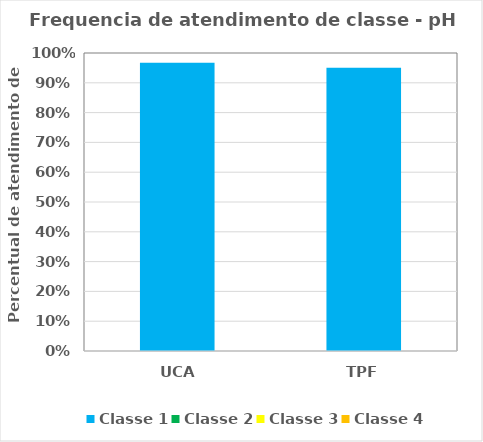
| Category | Classe 1 | Classe 2 | Classe 3 | Classe 4 |
|---|---|---|---|---|
| UCA | 0.967 | 0 | 0 | 0 |
| TPF | 0.951 | 0 | 0 | 0 |